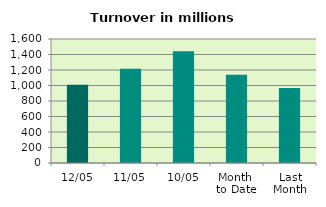
| Category | Series 0 |
|---|---|
| 12/05 | 1010.255 |
| 11/05 | 1215.546 |
| 10/05 | 1441.714 |
| Month 
to Date | 1137.877 |
| Last
Month | 968.247 |